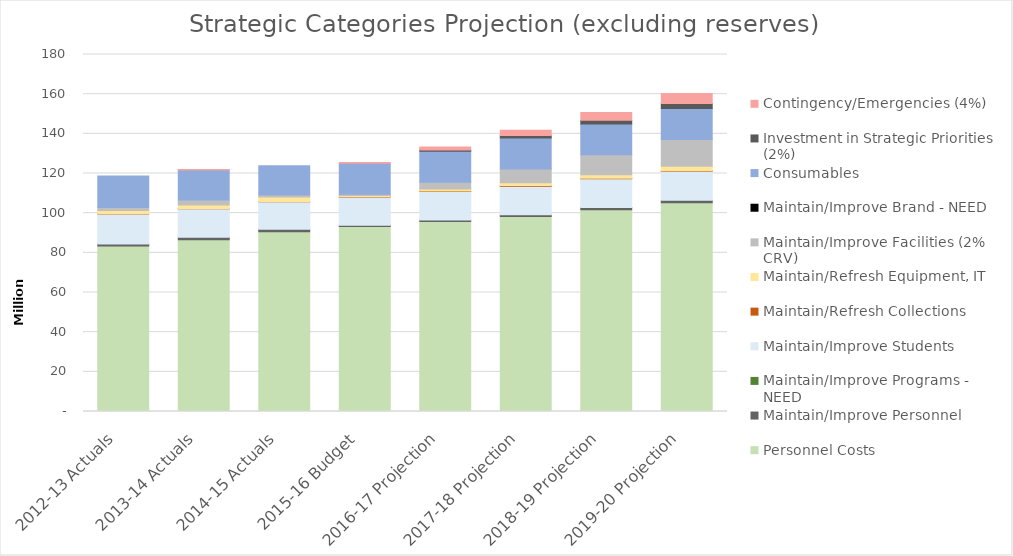
| Category | Personnel Costs | Administrator  | Faculty  | Staff  | TA/GA  | Student  | Benefits | Maintain/Improve Personnel | Maintain/Improve Programs - NEED | Maintain/Improve Students  | Maintain/Refresh Collections | Maintain/Refresh Equipment, IT | Maintain/Improve Facilities (2% CRV) | Maintain/Improve Brand - NEED | Consumables | Investment in Strategic Priorities (2%) | Contingency/Emergencies (4%) |
|---|---|---|---|---|---|---|---|---|---|---|---|---|---|---|---|---|---|
| 2012-13 Actuals | 83400000 |  |  |  |  |  |  | 1100000 | 0 | 15100000 | 100000 | 1600000 | 1600000 | 0 | 15900000 | 0 | 0 |
| 2013-14 Actuals | 86600000 |  |  |  |  |  |  | 1200000 | 0 | 14400000 | 200000 | 1700000 | 2600000 | 0 | 15100000 | 0 | 200000 |
| 2014-15 Actuals | 90600000 |  |  |  |  |  |  | 1300000 | 0 | 13900000 | 100000 | 2200000 | 1000000 | 0 | 14800000 | 0 | 0 |
| 2015-16 Budget | 93250000 |  |  |  |  |  |  | 650000 | 0 | 14200000 | 300000 | 500000 | 700000 | 0 | 15600000 | 0 | 300000 |
| 2016-17 Projection | 95800000 |  |  |  |  |  |  | 800000 | 0 | 14300000 | 300000 | 1000000 | 3400000 | 0 | 15600000 | 600000 | 1500000 |
| 2017-18 Projection | 98300000 |  |  |  |  |  |  | 900000 | 0 | 14400000 | 300000 | 1400000 | 7000000 | 0 | 15600000 | 1300000 | 2600000 |
| 2018-19 Projection | 101700000 |  |  |  |  |  |  | 1100000 | 0 | 14500000 | 300000 | 1800000 | 10000000 | 0 | 15600000 | 1900000 | 3800000 |
| 2019-20 Projection | 105300000 |  |  |  |  |  |  | 1200000 | 0 | 14600000 | 300000 | 2300000 | 13500000 | 0 | 15600000 | 2500000 | 5000000 |